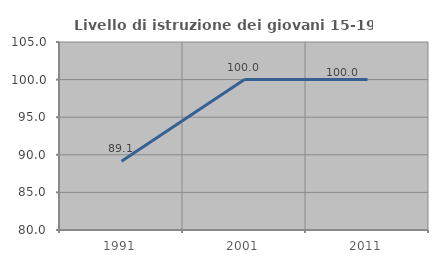
| Category | Livello di istruzione dei giovani 15-19 anni |
|---|---|
| 1991.0 | 89.13 |
| 2001.0 | 100 |
| 2011.0 | 100 |